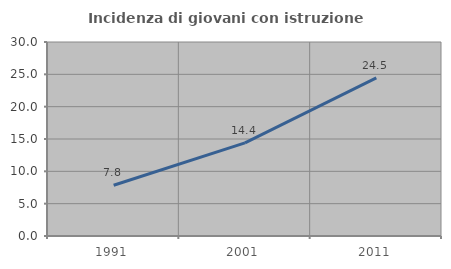
| Category | Incidenza di giovani con istruzione universitaria |
|---|---|
| 1991.0 | 7.84 |
| 2001.0 | 14.391 |
| 2011.0 | 24.452 |